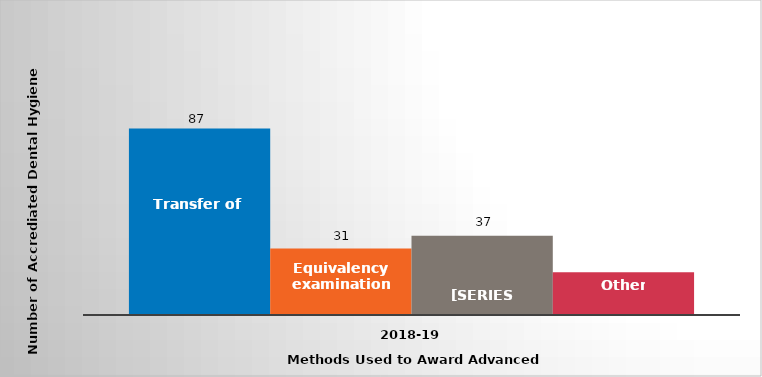
| Category | Transfer of credit | Equivalency examinations | Challenge examinations | Other |
|---|---|---|---|---|
| 2018-19 | 87 | 31 | 37 | 20 |